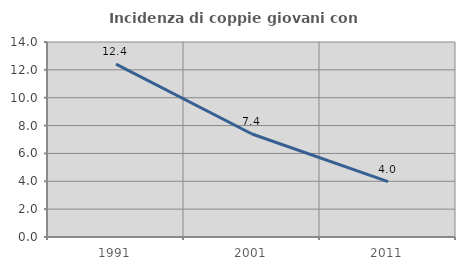
| Category | Incidenza di coppie giovani con figli |
|---|---|
| 1991.0 | 12.414 |
| 2001.0 | 7.393 |
| 2011.0 | 3.974 |